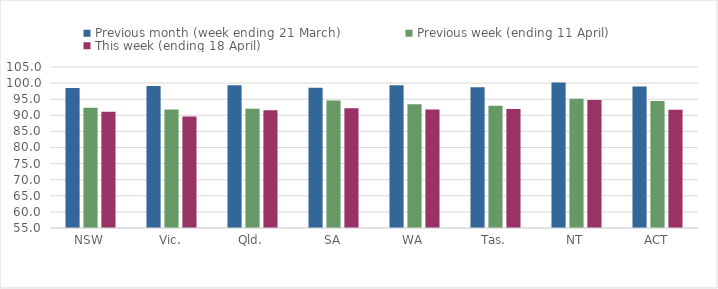
| Category | Previous month (week ending 21 March) | Previous week (ending 11 April) | This week (ending 18 April) |
|---|---|---|---|
| NSW | 98.506 | 92.358 | 91.133 |
| Vic. | 99.12 | 91.81 | 89.662 |
| Qld. | 99.327 | 92.067 | 91.535 |
| SA | 98.566 | 94.611 | 92.175 |
| WA | 99.342 | 93.44 | 91.78 |
| Tas. | 98.747 | 92.996 | 91.99 |
| NT | 100.219 | 95.177 | 94.771 |
| ACT | 98.966 | 94.436 | 91.742 |